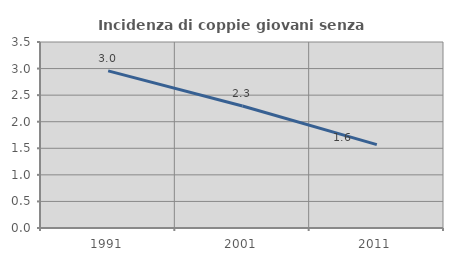
| Category | Incidenza di coppie giovani senza figli |
|---|---|
| 1991.0 | 2.957 |
| 2001.0 | 2.297 |
| 2011.0 | 1.568 |